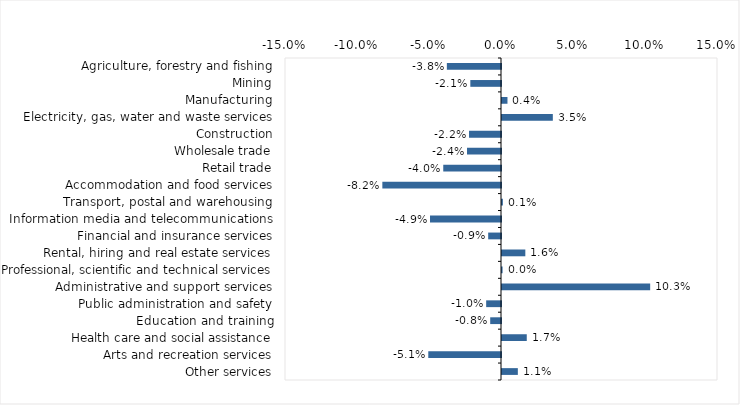
| Category | This week |
|---|---|
| Agriculture, forestry and fishing | -0.038 |
| Mining | -0.021 |
| Manufacturing | 0.004 |
| Electricity, gas, water and waste services | 0.035 |
| Construction | -0.022 |
| Wholesale trade | -0.024 |
| Retail trade | -0.04 |
| Accommodation and food services | -0.082 |
| Transport, postal and warehousing | 0.001 |
| Information media and telecommunications | -0.049 |
| Financial and insurance services | -0.009 |
| Rental, hiring and real estate services | 0.016 |
| Professional, scientific and technical services | 0 |
| Administrative and support services | 0.103 |
| Public administration and safety | -0.01 |
| Education and training | -0.008 |
| Health care and social assistance | 0.017 |
| Arts and recreation services | -0.05 |
| Other services | 0.011 |